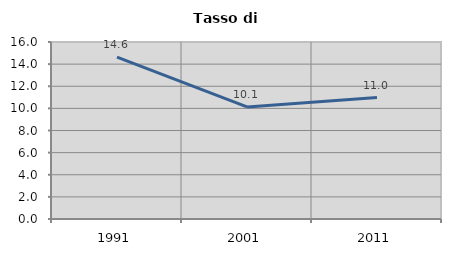
| Category | Tasso di disoccupazione   |
|---|---|
| 1991.0 | 14.641 |
| 2001.0 | 10.133 |
| 2011.0 | 10.981 |